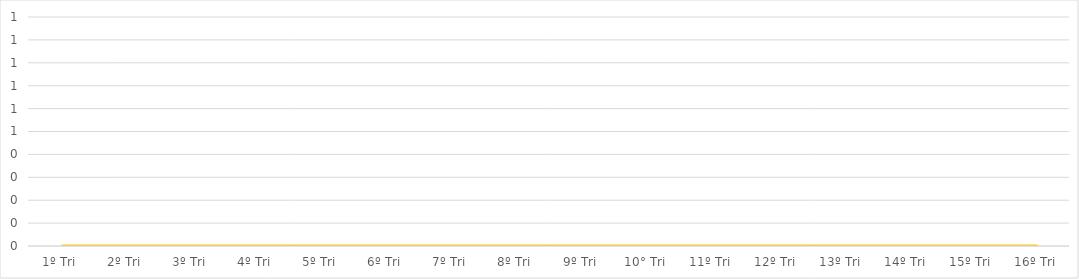
| Category | Total |
|---|---|
| 1º Tri | 0 |
| 2º Tri | 0 |
| 3º Tri | 0 |
| 4º Tri | 0 |
| 5º Tri | 0 |
| 6º Tri | 0 |
| 7º Tri | 0 |
| 8º Tri | 0 |
| 9º Tri | 0 |
| 10° Tri | 0 |
| 11º Tri | 0 |
| 12º Tri | 0 |
| 13º Tri | 0 |
| 14º Tri | 0 |
| 15º Tri | 0 |
| 16º Tri | 0 |